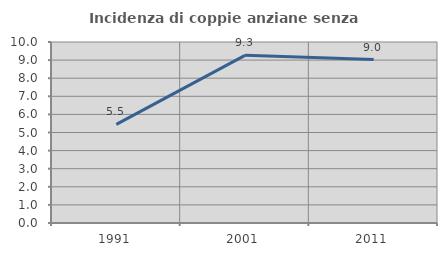
| Category | Incidenza di coppie anziane senza figli  |
|---|---|
| 1991.0 | 5.451 |
| 2001.0 | 9.262 |
| 2011.0 | 9.03 |